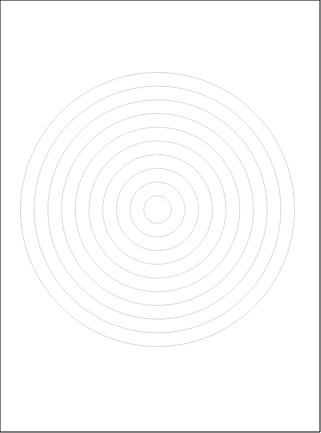
| Category | C2 | C1 | E8 | E7 | E6 | E5 | E4 | E3 | E2 | E1 | D4 | D3 | D2 | D1 |
|---|---|---|---|---|---|---|---|---|---|---|---|---|---|---|
| 0.0 | 0 | 0 | 0 | 0 | 0 | 0 | 0 | 0 | 0 | 0 | 0 | 0 | 0 | 0 |
| 1.0 | 0 | 0 | 0 | 0 | 0 | 0 | 0 | 0 | 0 | 0 | 0 | 0 | 0 | 0 |
| 2.0 | 0 | 0 | 0 | 0 | 0 | 0 | 0 | 0 | 0 | 0 | 0 | 0 | 0 | 0 |
| 3.0 | 0 | 0 | 0 | 0 | 0 | 0 | 0 | 0 | 0 | 0 | 0 | 0 | 0 | 0 |
| 4.0 | 0 | 0 | 0 | 0 | 0 | 0 | 0 | 0 | 0 | 0 | 0 | 0 | 0 | 0 |
| 5.0 | 0 | 0 | 0 | 0 | 0 | 0 | 0 | 0 | 0 | 0 | 0 | 0 | 0 | 0 |
| 6.0 | 0 | 0 | 0 | 0 | 0 | 0 | 0 | 0 | 0 | 0 | 0 | 0 | 0 | 0 |
| 7.0 | 0 | 0 | 0 | 0 | 0 | 0 | 0 | 0 | 0 | 0 | 0 | 0 | 0 | 0 |
| 8.0 | 0 | 0 | 0 | 0 | 0 | 0 | 0 | 0 | 0 | 0 | 0 | 0 | 0 | 0 |
| 9.0 | 0 | 0 | 0 | 0 | 0 | 0 | 0 | 0 | 0 | 0 | 0 | 0 | 0 | 0 |
| 10.0 | 0 | 0 | 0 | 0 | 0 | 0 | 0 | 0 | 0 | 0 | 0 | 0 | 0 | 0 |
| 11.0 | 0 | 0 | 0 | 0 | 0 | 0 | 0 | 0 | 0 | 0 | 0 | 0 | 0 | 0 |
| 12.0 | 0 | 0 | 0 | 0 | 0 | 0 | 0 | 0 | 0 | 0 | 0 | 0 | 0 | 0 |
| 13.0 | 0 | 0 | 0 | 0 | 0 | 0 | 0 | 0 | 0 | 0 | 0 | 0 | 0 | 0 |
| 14.0 | 0 | 0 | 0 | 0 | 0 | 0 | 0 | 0 | 0 | 0 | 0 | 0 | 0 | 0 |
| 15.0 | 0 | 0 | 0 | 0 | 0 | 0 | 0 | 0 | 0 | 0 | 0 | 0 | 0 | 0 |
| 16.0 | 0 | 0 | 0 | 0 | 0 | 0 | 0 | 0 | 0 | 0 | 0 | 0 | 0 | 0 |
| 17.0 | 0 | 0 | 0 | 0 | 0 | 0 | 0 | 0 | 0 | 0 | 0 | 0 | 0 | 0 |
| 18.0 | 0 | 0 | 0 | 0 | 0 | 0 | 0 | 0 | 0 | 0 | 0 | 0 | 0 | 0 |
| 19.0 | 0 | 0 | 0 | 0 | 0 | 0 | 0 | 0 | 0 | 0 | 0 | 0 | 0 | 0 |
| 20.0 | 0 | 0 | 0 | 0 | 0 | 0 | 0 | 0 | 0 | 0 | 0 | 0 | 0 | 0 |
| 21.0 | 0 | 0 | 0 | 0 | 0 | 0 | 0 | 0 | 0 | 0 | 0 | 0 | 0 | 0 |
| 22.0 | 0 | 0 | 0 | 0 | 0 | 0 | 0 | 0 | 0 | 0 | 0 | 0 | 0 | 0 |
| 23.0 | 0 | 0 | 0 | 0 | 0 | 0 | 0 | 0 | 0 | 0 | 0 | 0 | 0 | 0 |
| 24.0 | 0 | 0 | 0 | 0 | 0 | 0 | 0 | 0 | 0 | 0 | 0 | 0 | 0 | 0 |
| 25.0 | 0 | 0 | 0 | 0 | 0 | 0 | 0 | 0 | 0 | 0 | 0 | 0 | 0 | 0 |
| 26.0 | 0 | 0 | 0 | 0 | 0 | 0 | 0 | 0 | 0 | 0 | 0 | 0 | 0 | 0 |
| 27.0 | 0 | 0 | 0 | 0 | 0 | 0 | 0 | 0 | 0 | 0 | 0 | 0 | 0 | 0 |
| 28.0 | 0 | 0 | 0 | 0 | 0 | 0 | 0 | 0 | 0 | 0 | 0 | 0 | 0 | 0 |
| 29.0 | 0 | 0 | 0 | 0 | 0 | 0 | 0 | 0 | 0 | 0 | 0 | 0 | 0 | 0 |
| 30.0 | 0 | 0 | 0 | 0 | 0 | 0 | 0 | 0 | 0 | 0 | 0 | 0 | 0 | 0 |
| 31.0 | 0 | 0 | 0 | 0 | 0 | 0 | 0 | 0 | 0 | 0 | 0 | 0 | 0 | 0 |
| 32.0 | 0 | 0 | 0 | 0 | 0 | 0 | 0 | 0 | 0 | 0 | 0 | 0 | 0 | 0 |
| 33.0 | 0 | 0 | 0 | 0 | 0 | 0 | 0 | 0 | 0 | 0 | 0 | 0 | 0 | 0 |
| 34.0 | 0 | 0 | 0 | 0 | 0 | 0 | 0 | 0 | 0 | 0 | 0 | 0 | 0 | 0 |
| 35.0 | 0 | 0 | 0 | 0 | 0 | 0 | 0 | 0 | 0 | 0 | 0 | 0 | 0 | 0 |
| 36.0 | 0 | 0 | 0 | 0 | 0 | 0 | 0 | 0 | 0 | 0 | 0 | 0 | 0 | 0 |
| 37.0 | 0 | 0 | 0 | 0 | 0 | 0 | 0 | 0 | 0 | 0 | 0 | 0 | 0 | 0 |
| 38.0 | 0 | 0 | 0 | 0 | 0 | 0 | 0 | 0 | 0 | 0 | 0 | 0 | 0 | 0 |
| 39.0 | 0 | 0 | 0 | 0 | 0 | 0 | 0 | 0 | 0 | 0 | 0 | 0 | 0 | 0 |
| 40.0 | 0 | 0 | 0 | 0 | 0 | 0 | 0 | 0 | 0 | 0 | 0 | 0 | 0 | 0 |
| 41.0 | 0 | 0 | 0 | 0 | 0 | 0 | 0 | 0 | 0 | 0 | 0 | 0 | 0 | 0 |
| 42.0 | 0 | 0 | 0 | 0 | 0 | 0 | 0 | 0 | 0 | 0 | 0 | 0 | 0 | 0 |
| 43.0 | 0 | 0 | 0 | 0 | 0 | 0 | 0 | 0 | 0 | 0 | 0 | 0 | 0 | 0 |
| 44.0 | 0 | 0 | 0 | 0 | 0 | 0 | 0 | 0 | 0 | 0 | 0 | 0 | 0 | 0 |
| 45.0 | 0 | 0 | 0 | 0 | 0 | 0 | 0 | 0 | 0 | 0 | 0 | 0 | 0 | 0 |
| 46.0 | 0 | 0 | 0 | 0 | 0 | 0 | 0 | 0 | 0 | 0 | 0 | 0 | 0 | 0 |
| 47.0 | 0 | 0 | 0 | 0 | 0 | 0 | 0 | 0 | 0 | 0 | 0 | 0 | 0 | 0 |
| 48.0 | 0 | 0 | 0 | 0 | 0 | 0 | 0 | 0 | 0 | 0 | 0 | 0 | 0 | 0 |
| 49.0 | 0 | 0 | 0 | 0 | 0 | 0 | 0 | 0 | 0 | 0 | 0 | 0 | 0 | 0 |
| 50.0 | 0 | 0 | 0 | 0 | 0 | 0 | 0 | 0 | 0 | 0 | 0 | 0 | 0 | 0 |
| 51.0 | 0 | 0 | 0 | 0 | 0 | 0 | 0 | 0 | 0 | 0 | 0 | 0 | 0 | 0 |
| 52.0 | 0 | 0 | 0 | 0 | 0 | 0 | 0 | 0 | 0 | 0 | 0 | 0 | 0 | 0 |
| 53.0 | 0 | 0 | 0 | 0 | 0 | 0 | 0 | 0 | 0 | 0 | 0 | 0 | 0 | 0 |
| 54.0 | 0 | 0 | 0 | 0 | 0 | 0 | 0 | 0 | 0 | 0 | 0 | 0 | 0 | 0 |
| 55.0 | 0 | 0 | 0 | 0 | 0 | 0 | 0 | 0 | 0 | 0 | 0 | 0 | 0 | 0 |
| 56.0 | 0 | 0 | 0 | 0 | 0 | 0 | 0 | 0 | 0 | 0 | 0 | 0 | 0 | 0 |
| 57.0 | 0 | 0 | 0 | 0 | 0 | 0 | 0 | 0 | 0 | 0 | 0 | 0 | 0 | 0 |
| 58.0 | 0 | 0 | 0 | 0 | 0 | 0 | 0 | 0 | 0 | 0 | 0 | 0 | 0 | 0 |
| 59.0 | 0 | 0 | 0 | 0 | 0 | 0 | 0 | 0 | 0 | 0 | 0 | 0 | 0 | 0 |
| 60.0 | 0 | 0 | 0 | 0 | 0 | 0 | 0 | 0 | 0 | 0 | 0 | 0 | 0 | 0 |
| 61.0 | 0 | 0 | 0 | 0 | 0 | 0 | 0 | 0 | 0 | 0 | 0 | 0 | 0 | 0 |
| 62.0 | 0 | 0 | 0 | 0 | 0 | 0 | 0 | 0 | 0 | 0 | 0 | 0 | 0 | 0 |
| 63.0 | 0 | 0 | 0 | 0 | 0 | 0 | 0 | 0 | 0 | 0 | 0 | 0 | 0 | 0 |
| 64.0 | 0 | 0 | 0 | 0 | 0 | 0 | 0 | 0 | 0 | 0 | 0 | 0 | 0 | 0 |
| 65.0 | 0 | 0 | 0 | 0 | 0 | 0 | 0 | 0 | 0 | 0 | 0 | 0 | 0 | 0 |
| 66.0 | 0 | 0 | 0 | 0 | 0 | 0 | 0 | 0 | 0 | 0 | 0 | 0 | 0 | 0 |
| 67.0 | 0 | 0 | 0 | 0 | 0 | 0 | 0 | 0 | 0 | 0 | 0 | 0 | 0 | 0 |
| 68.0 | 0 | 0 | 0 | 0 | 0 | 0 | 0 | 0 | 0 | 0 | 0 | 0 | 0 | 0 |
| 69.0 | 0 | 0 | 0 | 0 | 0 | 0 | 0 | 0 | 0 | 0 | 0 | 0 | 0 | 0 |
| 70.0 | 0 | 0 | 0 | 0 | 0 | 0 | 0 | 0 | 0 | 0 | 0 | 0 | 0 | 0 |
| 71.0 | 0 | 0 | 0 | 0 | 0 | 0 | 0 | 0 | 0 | 0 | 0 | 0 | 0 | 0 |
| 72.0 | 0 | 0 | 0 | 0 | 0 | 0 | 0 | 0 | 0 | 0 | 0 | 0 | 0 | 0 |
| 73.0 | 0 | 0 | 0 | 0 | 0 | 0 | 0 | 0 | 0 | 0 | 0 | 0 | 0 | 0 |
| 74.0 | 0 | 0 | 0 | 0 | 0 | 0 | 0 | 0 | 0 | 0 | 0 | 0 | 0 | 0 |
| 75.0 | 0 | 0 | 0 | 0 | 0 | 0 | 0 | 0 | 0 | 0 | 0 | 0 | 0 | 0 |
| 76.0 | 0 | 0 | 0 | 0 | 0 | 0 | 0 | 0 | 0 | 0 | 0 | 0 | 0 | 0 |
| 77.0 | 0 | 0 | 0 | 0 | 0 | 0 | 0 | 0 | 0 | 0 | 0 | 0 | 0 | 0 |
| 78.0 | 0 | 0 | 0 | 0 | 0 | 0 | 0 | 0 | 0 | 0 | 0 | 0 | 0 | 0 |
| 79.0 | 0 | 0 | 0 | 0 | 0 | 0 | 0 | 0 | 0 | 0 | 0 | 0 | 0 | 0 |
| 80.0 | 0 | 0 | 0 | 0 | 0 | 0 | 0 | 0 | 0 | 0 | 0 | 0 | 0 | 0 |
| 81.0 | 0 | 0 | 0 | 0 | 0 | 0 | 0 | 0 | 0 | 0 | 0 | 0 | 0 | 0 |
| 82.0 | 0 | 0 | 0 | 0 | 0 | 0 | 0 | 0 | 0 | 0 | 0 | 0 | 0 | 0 |
| 83.0 | 0 | 0 | 0 | 0 | 0 | 0 | 0 | 0 | 0 | 0 | 0 | 0 | 0 | 0 |
| 84.0 | 0 | 0 | 0 | 0 | 0 | 0 | 0 | 0 | 0 | 0 | 0 | 0 | 0 | 0 |
| 85.0 | 0 | 0 | 0 | 0 | 0 | 0 | 0 | 0 | 0 | 0 | 0 | 0 | 0 | 0 |
| 86.0 | 0 | 0 | 0 | 0 | 0 | 0 | 0 | 0 | 0 | 0 | 0 | 0 | 0 | 0 |
| 87.0 | 0 | 0 | 0 | 0 | 0 | 0 | 0 | 0 | 0 | 0 | 0 | 0 | 0 | 0 |
| 88.0 | 0 | 0 | 0 | 0 | 0 | 0 | 0 | 0 | 0 | 0 | 0 | 0 | 0 | 0 |
| 89.0 | 0 | 0 | 0 | 0 | 0 | 0 | 0 | 0 | 0 | 0 | 0 | 0 | 0 | 0 |
| 90.0 | 0 | 0 | 0 | 0 | 0 | 0 | 0 | 0 | 0 | 0 | 0 | 0 | 0 | 0 |
| 91.0 | 0 | 0 | 0 | 0 | 0 | 0 | 0 | 0 | 0 | 0 | 0 | 0 | 0 | 0 |
| 92.0 | 0 | 0 | 0 | 0 | 0 | 0 | 0 | 0 | 0 | 0 | 0 | 0 | 0 | 0 |
| 93.0 | 0 | 0 | 0 | 0 | 0 | 0 | 0 | 0 | 0 | 0 | 0 | 0 | 0 | 0 |
| 94.0 | 0 | 0 | 0 | 0 | 0 | 0 | 0 | 0 | 0 | 0 | 0 | 0 | 0 | 0 |
| 95.0 | 0 | 0 | 0 | 0 | 0 | 0 | 0 | 0 | 0 | 0 | 0 | 0 | 0 | 0 |
| 96.0 | 0 | 0 | 0 | 0 | 0 | 0 | 0 | 0 | 0 | 0 | 0 | 0 | 0 | 0 |
| 97.0 | 0 | 0 | 0 | 0 | 0 | 0 | 0 | 0 | 0 | 0 | 0 | 0 | 0 | 0 |
| 98.0 | 0 | 0 | 0 | 0 | 0 | 0 | 0 | 0 | 0 | 0 | 0 | 0 | 0 | 0 |
| 99.0 | 0 | 0 | 0 | 0 | 0 | 0 | 0 | 0 | 0 | 0 | 0 | 0 | 0 | 0 |
| 100.0 | 0 | 0 | 0 | 0 | 0 | 0 | 0 | 0 | 0 | 0 | 0 | 0 | 0 | 0 |
| 101.0 | 0 | 0 | 0 | 0 | 0 | 0 | 0 | 0 | 0 | 0 | 0 | 0 | 0 | 0 |
| 102.0 | 0 | 0 | 0 | 0 | 0 | 0 | 0 | 0 | 0 | 0 | 0 | 0 | 0 | 0 |
| 103.0 | 0 | 0 | 0 | 0 | 0 | 0 | 0 | 0 | 0 | 0 | 0 | 0 | 0 | 0 |
| 104.0 | 0 | 0 | 0 | 0 | 0 | 0 | 0 | 0 | 0 | 0 | 0 | 0 | 0 | 0 |
| 105.0 | 0 | 0 | 0 | 0 | 0 | 0 | 0 | 0 | 0 | 0 | 0 | 0 | 0 | 0 |
| 106.0 | 0 | 0 | 0 | 0 | 0 | 0 | 0 | 0 | 0 | 0 | 0 | 0 | 0 | 0 |
| 107.0 | 0 | 0 | 0 | 0 | 0 | 0 | 0 | 0 | 0 | 0 | 0 | 0 | 0 | 0 |
| 108.0 | 0 | 0 | 0 | 0 | 0 | 0 | 0 | 0 | 0 | 0 | 0 | 0 | 0 | 0 |
| 109.0 | 0 | 0 | 0 | 0 | 0 | 0 | 0 | 0 | 0 | 0 | 0 | 0 | 0 | 0 |
| 110.0 | 0 | 0 | 0 | 0 | 0 | 0 | 0 | 0 | 0 | 0 | 0 | 0 | 0 | 0 |
| 111.0 | 0 | 0 | 0 | 0 | 0 | 0 | 0 | 0 | 0 | 0 | 0 | 0 | 0 | 0 |
| 112.0 | 0 | 0 | 0 | 0 | 0 | 0 | 0 | 0 | 0 | 0 | 0 | 0 | 0 | 0 |
| 113.0 | 0 | 0 | 0 | 0 | 0 | 0 | 0 | 0 | 0 | 0 | 0 | 0 | 0 | 0 |
| 114.0 | 0 | 0 | 0 | 0 | 0 | 0 | 0 | 0 | 0 | 0 | 0 | 0 | 0 | 0 |
| 115.0 | 0 | 0 | 0 | 0 | 0 | 0 | 0 | 0 | 0 | 0 | 0 | 0 | 0 | 0 |
| 116.0 | 0 | 0 | 0 | 0 | 0 | 0 | 0 | 0 | 0 | 0 | 0 | 0 | 0 | 0 |
| 117.0 | 0 | 0 | 0 | 0 | 0 | 0 | 0 | 0 | 0 | 0 | 0 | 0 | 0 | 0 |
| 118.0 | 0 | 0 | 0 | 0 | 0 | 0 | 0 | 0 | 0 | 0 | 0 | 0 | 0 | 0 |
| 119.0 | 0 | 0 | 0 | 0 | 0 | 0 | 0 | 0 | 0 | 0 | 0 | 0 | 0 | 0 |
| 120.0 | 0 | 0 | 0 | 0 | 0 | 0 | 0 | 0 | 0 | 0 | 0 | 0 | 0 | 0 |
| 121.0 | 0 | 0 | 0 | 0 | 0 | 0 | 0 | 0 | 0 | 0 | 0 | 0 | 0 | 0 |
| 122.0 | 0 | 0 | 0 | 0 | 0 | 0 | 0 | 0 | 0 | 0 | 0 | 0 | 0 | 0 |
| 123.0 | 0 | 0 | 0 | 0 | 0 | 0 | 0 | 0 | 0 | 0 | 0 | 0 | 0 | 0 |
| 124.0 | 0 | 0 | 0 | 0 | 0 | 0 | 0 | 0 | 0 | 0 | 0 | 0 | 0 | 0 |
| 125.0 | 0 | 0 | 0 | 0 | 0 | 0 | 0 | 0 | 0 | 0 | 0 | 0 | 0 | 0 |
| 126.0 | 0 | 0 | 0 | 0 | 0 | 0 | 0 | 0 | 0 | 0 | 0 | 0 | 0 | 0 |
| 127.0 | 0 | 0 | 0 | 0 | 0 | 0 | 0 | 0 | 0 | 0 | 0 | 0 | 0 | 0 |
| 128.0 | 0 | 0 | 0 | 0 | 0 | 0 | 0 | 0 | 0 | 0 | 0 | 0 | 0 | 0 |
| 129.0 | 0 | 0 | 0 | 0 | 0 | 0 | 0 | 0 | 0 | 0 | 0 | 0 | 0 | 0 |
| 130.0 | 0 | 0 | 0 | 0 | 0 | 0 | 0 | 0 | 0 | 0 | 0 | 0 | 0 | 0 |
| 131.0 | 0 | 0 | 0 | 0 | 0 | 0 | 0 | 0 | 0 | 0 | 0 | 0 | 0 | 0 |
| 132.0 | 0 | 0 | 0 | 0 | 0 | 0 | 0 | 0 | 0 | 0 | 0 | 0 | 0 | 0 |
| 133.0 | 0 | 0 | 0 | 0 | 0 | 0 | 0 | 0 | 0 | 0 | 0 | 0 | 0 | 0 |
| 134.0 | 0 | 0 | 0 | 0 | 0 | 0 | 0 | 0 | 0 | 0 | 0 | 0 | 0 | 0 |
| 135.0 | 0 | 0 | 0 | 0 | 0 | 0 | 0 | 0 | 0 | 0 | 0 | 0 | 0 | 0 |
| 136.0 | 0 | 0 | 0 | 0 | 0 | 0 | 0 | 0 | 0 | 0 | 0 | 0 | 0 | 0 |
| 137.0 | 0 | 0 | 0 | 0 | 0 | 0 | 0 | 0 | 0 | 0 | 0 | 0 | 0 | 0 |
| 138.0 | 0 | 0 | 0 | 0 | 0 | 0 | 0 | 0 | 0 | 0 | 0 | 0 | 0 | 0 |
| 139.0 | 0 | 0 | 0 | 0 | 0 | 0 | 0 | 0 | 0 | 0 | 0 | 0 | 0 | 0 |
| 140.0 | 0 | 0 | 0 | 0 | 0 | 0 | 0 | 0 | 0 | 0 | 0 | 0 | 0 | 0 |
| 141.0 | 0 | 0 | 0 | 0 | 0 | 0 | 0 | 0 | 0 | 0 | 0 | 0 | 0 | 0 |
| 142.0 | 0 | 0 | 0 | 0 | 0 | 0 | 0 | 0 | 0 | 0 | 0 | 0 | 0 | 0 |
| 143.0 | 0 | 0 | 0 | 0 | 0 | 0 | 0 | 0 | 0 | 0 | 0 | 0 | 0 | 0 |
| 144.0 | 0 | 0 | 0 | 0 | 0 | 0 | 0 | 0 | 0 | 0 | 0 | 0 | 0 | 0 |
| 145.0 | 0 | 0 | 0 | 0 | 0 | 0 | 0 | 0 | 0 | 0 | 0 | 0 | 0 | 0 |
| 146.0 | 0 | 0 | 0 | 0 | 0 | 0 | 0 | 0 | 0 | 0 | 0 | 0 | 0 | 0 |
| 147.0 | 0 | 0 | 0 | 0 | 0 | 0 | 0 | 0 | 0 | 0 | 0 | 0 | 0 | 0 |
| 148.0 | 0 | 0 | 0 | 0 | 0 | 0 | 0 | 0 | 0 | 0 | 0 | 0 | 0 | 0 |
| 149.0 | 0 | 0 | 0 | 0 | 0 | 0 | 0 | 0 | 0 | 0 | 0 | 0 | 0 | 0 |
| 150.0 | 0 | 0 | 0 | 0 | 0 | 0 | 0 | 0 | 0 | 0 | 0 | 0 | 0 | 0 |
| 151.0 | 0 | 0 | 0 | 0 | 0 | 0 | 0 | 0 | 0 | 0 | 0 | 0 | 0 | 0 |
| 152.0 | 0 | 0 | 0 | 0 | 0 | 0 | 0 | 0 | 0 | 0 | 0 | 0 | 0 | 0 |
| 153.0 | 0 | 0 | 0 | 0 | 0 | 0 | 0 | 0 | 0 | 0 | 0 | 0 | 0 | 0 |
| 154.0 | 0 | 0 | 0 | 0 | 0 | 0 | 0 | 0 | 0 | 0 | 0 | 0 | 0 | 0 |
| 155.0 | 0 | 0 | 0 | 0 | 0 | 0 | 0 | 0 | 0 | 0 | 0 | 0 | 0 | 0 |
| 156.0 | 0 | 0 | 0 | 0 | 0 | 0 | 0 | 0 | 0 | 0 | 0 | 0 | 0 | 0 |
| 157.0 | 0 | 0 | 0 | 0 | 0 | 0 | 0 | 0 | 0 | 0 | 0 | 0 | 0 | 0 |
| 158.0 | 0 | 0 | 0 | 0 | 0 | 0 | 0 | 0 | 0 | 0 | 0 | 0 | 0 | 0 |
| 159.0 | 0 | 0 | 0 | 0 | 0 | 0 | 0 | 0 | 0 | 0 | 0 | 0 | 0 | 0 |
| 160.0 | 0 | 0 | 0 | 0 | 0 | 0 | 0 | 0 | 0 | 0 | 0 | 0 | 0 | 0 |
| 161.0 | 0 | 0 | 0 | 0 | 0 | 0 | 0 | 0 | 0 | 0 | 0 | 0 | 0 | 0 |
| 162.0 | 0 | 0 | 0 | 0 | 0 | 0 | 0 | 0 | 0 | 0 | 0 | 0 | 0 | 0 |
| 163.0 | 0 | 0 | 0 | 0 | 0 | 0 | 0 | 0 | 0 | 0 | 0 | 0 | 0 | 0 |
| 164.0 | 0 | 0 | 0 | 0 | 0 | 0 | 0 | 0 | 0 | 0 | 0 | 0 | 0 | 0 |
| 165.0 | 0 | 0 | 0 | 0 | 0 | 0 | 0 | 0 | 0 | 0 | 0 | 0 | 0 | 0 |
| 166.0 | 0 | 0 | 0 | 0 | 0 | 0 | 0 | 0 | 0 | 0 | 0 | 0 | 0 | 0 |
| 167.0 | 0 | 0 | 0 | 0 | 0 | 0 | 0 | 0 | 0 | 0 | 0 | 0 | 0 | 0 |
| 168.0 | 0 | 0 | 0 | 0 | 0 | 0 | 0 | 0 | 0 | 0 | 0 | 0 | 0 | 0 |
| 169.0 | 0 | 0 | 0 | 0 | 0 | 0 | 0 | 0 | 0 | 0 | 0 | 0 | 0 | 0 |
| 170.0 | 0 | 0 | 0 | 0 | 0 | 0 | 0 | 0 | 0 | 0 | 0 | 0 | 0 | 0 |
| 171.0 | 0 | 0 | 0 | 0 | 0 | 0 | 0 | 0 | 0 | 0 | 0 | 0 | 0 | 0 |
| 172.0 | 0 | 0 | 0 | 0 | 0 | 0 | 0 | 0 | 0 | 0 | 0 | 0 | 0 | 0 |
| 173.0 | 0 | 0 | 0 | 0 | 0 | 0 | 0 | 0 | 0 | 0 | 0 | 0 | 0 | 0 |
| 174.0 | 0 | 0 | 0 | 0 | 0 | 0 | 0 | 0 | 0 | 0 | 0 | 0 | 0 | 0 |
| 175.0 | 0 | 0 | 0 | 0 | 0 | 0 | 0 | 0 | 0 | 0 | 0 | 0 | 0 | 0 |
| 176.0 | 0 | 0 | 0 | 0 | 0 | 0 | 0 | 0 | 0 | 0 | 0 | 0 | 0 | 0 |
| 177.0 | 0 | 0 | 0 | 0 | 0 | 0 | 0 | 0 | 0 | 0 | 0 | 0 | 0 | 0 |
| 178.0 | 0 | 0 | 0 | 0 | 0 | 0 | 0 | 0 | 0 | 0 | 0 | 0 | 0 | 0 |
| 179.0 | 0 | 0 | 0 | 0 | 0 | 0 | 0 | 0 | 0 | 0 | 0 | 0 | 0 | 0 |
| 180.0 | 0 | 0 | 0 | 0 | 0 | 0 | 0 | 0 | 0 | 0 | 0 | 0 | 0 | 0 |
| 181.0 | 0 | 0 | 0 | 0 | 0 | 0 | 0 | 0 | 0 | 0 | 0 | 0 | 0 | 0 |
| 182.0 | 0 | 0 | 0 | 0 | 0 | 0 | 0 | 0 | 0 | 0 | 0 | 0 | 0 | 0 |
| 183.0 | 0 | 0 | 0 | 0 | 0 | 0 | 0 | 0 | 0 | 0 | 0 | 0 | 0 | 0 |
| 184.0 | 0 | 0 | 0 | 0 | 0 | 0 | 0 | 0 | 0 | 0 | 0 | 0 | 0 | 0 |
| 185.0 | 0 | 0 | 0 | 0 | 0 | 0 | 0 | 0 | 0 | 0 | 0 | 0 | 0 | 0 |
| 186.0 | 0 | 0 | 0 | 0 | 0 | 0 | 0 | 0 | 0 | 0 | 0 | 0 | 0 | 0 |
| 187.0 | 0 | 0 | 0 | 0 | 0 | 0 | 0 | 0 | 0 | 0 | 0 | 0 | 0 | 0 |
| 188.0 | 0 | 0 | 0 | 0 | 0 | 0 | 0 | 0 | 0 | 0 | 0 | 0 | 0 | 0 |
| 189.0 | 0 | 0 | 0 | 0 | 0 | 0 | 0 | 0 | 0 | 0 | 0 | 0 | 0 | 0 |
| 190.0 | 0 | 0 | 0 | 0 | 0 | 0 | 0 | 0 | 0 | 0 | 0 | 0 | 0 | 0 |
| 191.0 | 0 | 0 | 0 | 0 | 0 | 0 | 0 | 0 | 0 | 0 | 0 | 0 | 0 | 0 |
| 192.0 | 0 | 0 | 0 | 0 | 0 | 0 | 0 | 0 | 0 | 0 | 0 | 0 | 0 | 0 |
| 193.0 | 0 | 0 | 0 | 0 | 0 | 0 | 0 | 0 | 0 | 0 | 0 | 0 | 0 | 0 |
| 194.0 | 0 | 0 | 0 | 0 | 0 | 0 | 0 | 0 | 0 | 0 | 0 | 0 | 0 | 0 |
| 195.0 | 0 | 0 | 0 | 0 | 0 | 0 | 0 | 0 | 0 | 0 | 0 | 0 | 0 | 0 |
| 196.0 | 0 | 0 | 0 | 0 | 0 | 0 | 0 | 0 | 0 | 0 | 0 | 0 | 0 | 0 |
| 197.0 | 0 | 0 | 0 | 0 | 0 | 0 | 0 | 0 | 0 | 0 | 0 | 0 | 0 | 0 |
| 198.0 | 0 | 0 | 0 | 0 | 0 | 0 | 0 | 0 | 0 | 0 | 0 | 0 | 0 | 0 |
| 199.0 | 0 | 0 | 0 | 0 | 0 | 0 | 0 | 0 | 0 | 0 | 0 | 0 | 0 | 0 |
| 200.0 | 0 | 0 | 0 | 0 | 0 | 0 | 0 | 0 | 0 | 0 | 0 | 0 | 0 | 0 |
| 201.0 | 0 | 0 | 0 | 0 | 0 | 0 | 0 | 0 | 0 | 0 | 0 | 0 | 0 | 0 |
| 202.0 | 0 | 0 | 0 | 0 | 0 | 0 | 0 | 0 | 0 | 0 | 0 | 0 | 0 | 0 |
| 203.0 | 0 | 0 | 0 | 0 | 0 | 0 | 0 | 0 | 0 | 0 | 0 | 0 | 0 | 0 |
| 204.0 | 0 | 0 | 0 | 0 | 0 | 0 | 0 | 0 | 0 | 0 | 0 | 0 | 0 | 0 |
| 205.0 | 0 | 0 | 0 | 0 | 0 | 0 | 0 | 0 | 0 | 0 | 0 | 0 | 0 | 0 |
| 206.0 | 0 | 0 | 0 | 0 | 0 | 0 | 0 | 0 | 0 | 0 | 0 | 0 | 0 | 0 |
| 207.0 | 0 | 0 | 0 | 0 | 0 | 0 | 0 | 0 | 0 | 0 | 0 | 0 | 0 | 0 |
| 208.0 | 0 | 0 | 0 | 0 | 0 | 0 | 0 | 0 | 0 | 0 | 0 | 0 | 0 | 0 |
| 209.0 | 0 | 0 | 0 | 0 | 0 | 0 | 0 | 0 | 0 | 0 | 0 | 0 | 0 | 0 |
| 210.0 | 0 | 0 | 0 | 0 | 0 | 0 | 0 | 0 | 0 | 0 | 0 | 0 | 0 | 0 |
| 211.0 | 0 | 0 | 0 | 0 | 0 | 0 | 0 | 0 | 0 | 0 | 0 | 0 | 0 | 0 |
| 212.0 | 0 | 0 | 0 | 0 | 0 | 0 | 0 | 0 | 0 | 0 | 0 | 0 | 0 | 0 |
| 213.0 | 0 | 0 | 0 | 0 | 0 | 0 | 0 | 0 | 0 | 0 | 0 | 0 | 0 | 0 |
| 214.0 | 0 | 0 | 0 | 0 | 0 | 0 | 0 | 0 | 0 | 0 | 0 | 0 | 0 | 0 |
| 215.0 | 0 | 0 | 0 | 0 | 0 | 0 | 0 | 0 | 0 | 0 | 0 | 0 | 0 | 0 |
| 216.0 | 0 | 0 | 0 | 0 | 0 | 0 | 0 | 0 | 0 | 0 | 0 | 0 | 0 | 0 |
| 217.0 | 0 | 0 | 0 | 0 | 0 | 0 | 0 | 0 | 0 | 0 | 0 | 0 | 0 | 0 |
| 218.0 | 0 | 0 | 0 | 0 | 0 | 0 | 0 | 0 | 0 | 0 | 0 | 0 | 0 | 0 |
| 219.0 | 0 | 0 | 0 | 0 | 0 | 0 | 0 | 0 | 0 | 0 | 0 | 0 | 0 | 0 |
| 220.0 | 0 | 0 | 0 | 0 | 0 | 0 | 0 | 0 | 0 | 0 | 0 | 0 | 0 | 0 |
| 221.0 | 0 | 0 | 0 | 0 | 0 | 0 | 0 | 0 | 0 | 0 | 0 | 0 | 0 | 0 |
| 222.0 | 0 | 0 | 0 | 0 | 0 | 0 | 0 | 0 | 0 | 0 | 0 | 0 | 0 | 0 |
| 223.0 | 0 | 0 | 0 | 0 | 0 | 0 | 0 | 0 | 0 | 0 | 0 | 0 | 0 | 0 |
| 224.0 | 0 | 0 | 0 | 0 | 0 | 0 | 0 | 0 | 0 | 0 | 0 | 0 | 0 | 0 |
| 225.0 | 0 | 0 | 0 | 0 | 0 | 0 | 0 | 0 | 0 | 0 | 0 | 0 | 0 | 0 |
| 226.0 | 0 | 0 | 0 | 0 | 0 | 0 | 0 | 0 | 0 | 0 | 0 | 0 | 0 | 0 |
| 227.0 | 0 | 0 | 0 | 0 | 0 | 0 | 0 | 0 | 0 | 0 | 0 | 0 | 0 | 0 |
| 228.0 | 0 | 0 | 0 | 0 | 0 | 0 | 0 | 0 | 0 | 0 | 0 | 0 | 0 | 0 |
| 229.0 | 0 | 0 | 0 | 0 | 0 | 0 | 0 | 0 | 0 | 0 | 0 | 0 | 0 | 0 |
| 230.0 | 0 | 0 | 0 | 0 | 0 | 0 | 0 | 0 | 0 | 0 | 0 | 0 | 0 | 0 |
| 231.0 | 0 | 0 | 0 | 0 | 0 | 0 | 0 | 0 | 0 | 0 | 0 | 0 | 0 | 0 |
| 232.0 | 0 | 0 | 0 | 0 | 0 | 0 | 0 | 0 | 0 | 0 | 0 | 0 | 0 | 0 |
| 233.0 | 0 | 0 | 0 | 0 | 0 | 0 | 0 | 0 | 0 | 0 | 0 | 0 | 0 | 0 |
| 234.0 | 0 | 0 | 0 | 0 | 0 | 0 | 0 | 0 | 0 | 0 | 0 | 0 | 0 | 0 |
| 235.0 | 0 | 0 | 0 | 0 | 0 | 0 | 0 | 0 | 0 | 0 | 0 | 0 | 0 | 0 |
| 236.0 | 0 | 0 | 0 | 0 | 0 | 0 | 0 | 0 | 0 | 0 | 0 | 0 | 0 | 0 |
| 237.0 | 0 | 0 | 0 | 0 | 0 | 0 | 0 | 0 | 0 | 0 | 0 | 0 | 0 | 0 |
| 238.0 | 0 | 0 | 0 | 0 | 0 | 0 | 0 | 0 | 0 | 0 | 0 | 0 | 0 | 0 |
| 239.0 | 0 | 0 | 0 | 0 | 0 | 0 | 0 | 0 | 0 | 0 | 0 | 0 | 0 | 0 |
| 240.0 | 0 | 0 | 0 | 0 | 0 | 0 | 0 | 0 | 0 | 0 | 0 | 0 | 0 | 0 |
| 241.0 | 0 | 0 | 0 | 0 | 0 | 0 | 0 | 0 | 0 | 0 | 0 | 0 | 0 | 0 |
| 242.0 | 0 | 0 | 0 | 0 | 0 | 0 | 0 | 0 | 0 | 0 | 0 | 0 | 0 | 0 |
| 243.0 | 0 | 0 | 0 | 0 | 0 | 0 | 0 | 0 | 0 | 0 | 0 | 0 | 0 | 0 |
| 244.0 | 0 | 0 | 0 | 0 | 0 | 0 | 0 | 0 | 0 | 0 | 0 | 0 | 0 | 0 |
| 245.0 | 0 | 0 | 0 | 0 | 0 | 0 | 0 | 0 | 0 | 0 | 0 | 0 | 0 | 0 |
| 246.0 | 0 | 0 | 0 | 0 | 0 | 0 | 0 | 0 | 0 | 0 | 0 | 0 | 0 | 0 |
| 247.0 | 0 | 0 | 0 | 0 | 0 | 0 | 0 | 0 | 0 | 0 | 0 | 0 | 0 | 0 |
| 248.0 | 0 | 0 | 0 | 0 | 0 | 0 | 0 | 0 | 0 | 0 | 0 | 0 | 0 | 0 |
| 249.0 | 0 | 0 | 0 | 0 | 0 | 0 | 0 | 0 | 0 | 0 | 0 | 0 | 0 | 0 |
| 250.0 | 0 | 0 | 0 | 0 | 0 | 0 | 0 | 0 | 0 | 0 | 0 | 0 | 0 | 0 |
| 251.0 | 0 | 0 | 0 | 0 | 0 | 0 | 0 | 0 | 0 | 0 | 0 | 0 | 0 | 0 |
| 252.0 | 0 | 0 | 0 | 0 | 0 | 0 | 0 | 0 | 0 | 0 | 0 | 0 | 0 | 0 |
| 253.0 | 0 | 0 | 0 | 0 | 0 | 0 | 0 | 0 | 0 | 0 | 0 | 0 | 0 | 0 |
| 254.0 | 0 | 0 | 0 | 0 | 0 | 0 | 0 | 0 | 0 | 0 | 0 | 0 | 0 | 0 |
| 255.0 | 0 | 0 | 0 | 0 | 0 | 0 | 0 | 0 | 0 | 0 | 0 | 0 | 0 | 0 |
| 256.0 | 0 | 0 | 0 | 0 | 0 | 0 | 0 | 0 | 0 | 0 | 0 | 0 | 0 | 0 |
| 257.0 | 0 | 0 | 0 | 0 | 0 | 0 | 0 | 0 | 0 | 0 | 0 | 0 | 0 | 0 |
| 258.0 | 0 | 0 | 0 | 0 | 0 | 0 | 0 | 0 | 0 | 0 | 0 | 0 | 0 | 0 |
| 259.0 | 0 | 0 | 0 | 0 | 0 | 0 | 0 | 0 | 0 | 0 | 0 | 0 | 0 | 0 |
| 260.0 | 0 | 0 | 0 | 0 | 0 | 0 | 0 | 0 | 0 | 0 | 0 | 0 | 0 | 0 |
| 261.0 | 0 | 0 | 0 | 0 | 0 | 0 | 0 | 0 | 0 | 0 | 0 | 0 | 0 | 0 |
| 262.0 | 0 | 0 | 0 | 0 | 0 | 0 | 0 | 0 | 0 | 0 | 0 | 0 | 0 | 0 |
| 263.0 | 0 | 0 | 0 | 0 | 0 | 0 | 0 | 0 | 0 | 0 | 0 | 0 | 0 | 0 |
| 264.0 | 0 | 0 | 0 | 0 | 0 | 0 | 0 | 0 | 0 | 0 | 0 | 0 | 0 | 0 |
| 265.0 | 0 | 0 | 0 | 0 | 0 | 0 | 0 | 0 | 0 | 0 | 0 | 0 | 0 | 0 |
| 266.0 | 0 | 0 | 0 | 0 | 0 | 0 | 0 | 0 | 0 | 0 | 0 | 0 | 0 | 0 |
| 267.0 | 0 | 0 | 0 | 0 | 0 | 0 | 0 | 0 | 0 | 0 | 0 | 0 | 0 | 0 |
| 268.0 | 0 | 0 | 0 | 0 | 0 | 0 | 0 | 0 | 0 | 0 | 0 | 0 | 0 | 0 |
| 269.0 | 0 | 0 | 0 | 0 | 0 | 0 | 0 | 0 | 0 | 0 | 0 | 0 | 0 | 0 |
| 270.0 | 0 | 0 | 0 | 0 | 0 | 0 | 0 | 0 | 0 | 0 | 0 | 0 | 0 | 0 |
| 271.0 | 0 | 0 | 0 | 0 | 0 | 0 | 0 | 0 | 0 | 0 | 0 | 0 | 0 | 0 |
| 272.0 | 0 | 0 | 0 | 0 | 0 | 0 | 0 | 0 | 0 | 0 | 0 | 0 | 0 | 0 |
| 273.0 | 0 | 0 | 0 | 0 | 0 | 0 | 0 | 0 | 0 | 0 | 0 | 0 | 0 | 0 |
| 274.0 | 0 | 0 | 0 | 0 | 0 | 0 | 0 | 0 | 0 | 0 | 0 | 0 | 0 | 0 |
| 275.0 | 0 | 0 | 0 | 0 | 0 | 0 | 0 | 0 | 0 | 0 | 0 | 0 | 0 | 0 |
| 276.0 | 0 | 0 | 0 | 0 | 0 | 0 | 0 | 0 | 0 | 0 | 0 | 0 | 0 | 0 |
| 277.0 | 0 | 0 | 0 | 0 | 0 | 0 | 0 | 0 | 0 | 0 | 0 | 0 | 0 | 0 |
| 278.0 | 0 | 0 | 0 | 0 | 0 | 0 | 0 | 0 | 0 | 0 | 0 | 0 | 0 | 0 |
| 279.0 | 0 | 0 | 0 | 0 | 0 | 0 | 0 | 0 | 0 | 0 | 0 | 0 | 0 | 0 |
| 280.0 | 0 | 0 | 0 | 0 | 0 | 0 | 0 | 0 | 0 | 0 | 0 | 0 | 0 | 0 |
| 281.0 | 0 | 0 | 0 | 0 | 0 | 0 | 0 | 0 | 0 | 0 | 0 | 0 | 0 | 0 |
| 282.0 | 0 | 0 | 0 | 0 | 0 | 0 | 0 | 0 | 0 | 0 | 0 | 0 | 0 | 0 |
| 283.0 | 0 | 0 | 0 | 0 | 0 | 0 | 0 | 0 | 0 | 0 | 0 | 0 | 0 | 0 |
| 284.0 | 0 | 0 | 0 | 0 | 0 | 0 | 0 | 0 | 0 | 0 | 0 | 0 | 0 | 0 |
| 285.0 | 0 | 0 | 0 | 0 | 0 | 0 | 0 | 0 | 0 | 0 | 0 | 0 | 0 | 0 |
| 286.0 | 0 | 0 | 0 | 0 | 0 | 0 | 0 | 0 | 0 | 0 | 0 | 0 | 0 | 0 |
| 287.0 | 0 | 0 | 0 | 0 | 0 | 0 | 0 | 0 | 0 | 0 | 0 | 0 | 0 | 0 |
| 288.0 | 0 | 0 | 0 | 0 | 0 | 0 | 0 | 0 | 0 | 0 | 0 | 0 | 0 | 0 |
| 289.0 | 0 | 0 | 0 | 0 | 0 | 0 | 0 | 0 | 0 | 0 | 0 | 0 | 0 | 0 |
| 290.0 | 0 | 0 | 0 | 0 | 0 | 0 | 0 | 0 | 0 | 0 | 0 | 0 | 0 | 0 |
| 291.0 | 0 | 0 | 0 | 0 | 0 | 0 | 0 | 0 | 0 | 0 | 0 | 0 | 0 | 0 |
| 292.0 | 0 | 0 | 0 | 0 | 0 | 0 | 0 | 0 | 0 | 0 | 0 | 0 | 0 | 0 |
| 293.0 | 0 | 0 | 0 | 0 | 0 | 0 | 0 | 0 | 0 | 0 | 0 | 0 | 0 | 0 |
| 294.0 | 0 | 0 | 0 | 0 | 0 | 0 | 0 | 0 | 0 | 0 | 0 | 0 | 0 | 0 |
| 295.0 | 0 | 0 | 0 | 0 | 0 | 0 | 0 | 0 | 0 | 0 | 0 | 0 | 0 | 0 |
| 296.0 | 0 | 0 | 0 | 0 | 0 | 0 | 0 | 0 | 0 | 0 | 0 | 0 | 0 | 0 |
| 297.0 | 0 | 0 | 0 | 0 | 0 | 0 | 0 | 0 | 0 | 0 | 0 | 0 | 0 | 0 |
| 298.0 | 0 | 0 | 0 | 0 | 0 | 0 | 0 | 0 | 0 | 0 | 0 | 0 | 0 | 0 |
| 299.0 | 0 | 0 | 0 | 0 | 0 | 0 | 0 | 0 | 0 | 0 | 0 | 0 | 0 | 0 |
| 300.0 | 0 | 0 | 0 | 0 | 0 | 0 | 0 | 0 | 0 | 0 | 0 | 0 | 0 | 0 |
| 301.0 | 0 | 0 | 0 | 0 | 0 | 0 | 0 | 0 | 0 | 0 | 0 | 0 | 0 | 0 |
| 302.0 | 0 | 0 | 0 | 0 | 0 | 0 | 0 | 0 | 0 | 0 | 0 | 0 | 0 | 0 |
| 303.0 | 0 | 0 | 0 | 0 | 0 | 0 | 0 | 0 | 0 | 0 | 0 | 0 | 0 | 0 |
| 304.0 | 0 | 0 | 0 | 0 | 0 | 0 | 0 | 0 | 0 | 0 | 0 | 0 | 0 | 0 |
| 305.0 | 0 | 0 | 0 | 0 | 0 | 0 | 0 | 0 | 0 | 0 | 0 | 0 | 0 | 0 |
| 306.0 | 0 | 0 | 0 | 0 | 0 | 0 | 0 | 0 | 0 | 0 | 0 | 0 | 0 | 0 |
| 307.0 | 0 | 0 | 0 | 0 | 0 | 0 | 0 | 0 | 0 | 0 | 0 | 0 | 0 | 0 |
| 308.0 | 0 | 0 | 0 | 0 | 0 | 0 | 0 | 0 | 0 | 0 | 0 | 0 | 0 | 0 |
| 309.0 | 0 | 0 | 0 | 0 | 0 | 0 | 0 | 0 | 0 | 0 | 0 | 0 | 0 | 0 |
| 310.0 | 0 | 0 | 0 | 0 | 0 | 0 | 0 | 0 | 0 | 0 | 0 | 0 | 0 | 0 |
| 311.0 | 0 | 0 | 0 | 0 | 0 | 0 | 0 | 0 | 0 | 0 | 0 | 0 | 0 | 0 |
| 312.0 | 0 | 0 | 0 | 0 | 0 | 0 | 0 | 0 | 0 | 0 | 0 | 0 | 0 | 0 |
| 313.0 | 0 | 0 | 0 | 0 | 0 | 0 | 0 | 0 | 0 | 0 | 0 | 0 | 0 | 0 |
| 314.0 | 0 | 0 | 0 | 0 | 0 | 0 | 0 | 0 | 0 | 0 | 0 | 0 | 0 | 0 |
| 315.0 | 0 | 0 | 0 | 0 | 0 | 0 | 0 | 0 | 0 | 0 | 0 | 0 | 0 | 0 |
| 316.0 | 0 | 0 | 0 | 0 | 0 | 0 | 0 | 0 | 0 | 0 | 0 | 0 | 0 | 0 |
| 317.0 | 0 | 0 | 0 | 0 | 0 | 0 | 0 | 0 | 0 | 0 | 0 | 0 | 0 | 0 |
| 318.0 | 0 | 0 | 0 | 0 | 0 | 0 | 0 | 0 | 0 | 0 | 0 | 0 | 0 | 0 |
| 319.0 | 0 | 0 | 0 | 0 | 0 | 0 | 0 | 0 | 0 | 0 | 0 | 0 | 0 | 0 |
| 320.0 | 0 | 0 | 0 | 0 | 0 | 0 | 0 | 0 | 0 | 0 | 0 | 0 | 0 | 0 |
| 321.0 | 0 | 0 | 0 | 0 | 0 | 0 | 0 | 0 | 0 | 0 | 0 | 0 | 0 | 0 |
| 322.0 | 0 | 0 | 0 | 0 | 0 | 0 | 0 | 0 | 0 | 0 | 0 | 0 | 0 | 0 |
| 323.0 | 0 | 0 | 0 | 0 | 0 | 0 | 0 | 0 | 0 | 0 | 0 | 0 | 0 | 0 |
| 324.0 | 0 | 0 | 0 | 0 | 0 | 0 | 0 | 0 | 0 | 0 | 0 | 0 | 0 | 0 |
| 325.0 | 0 | 0 | 0 | 0 | 0 | 0 | 0 | 0 | 0 | 0 | 0 | 0 | 0 | 0 |
| 326.0 | 0 | 0 | 0 | 0 | 0 | 0 | 0 | 0 | 0 | 0 | 0 | 0 | 0 | 0 |
| 327.0 | 0 | 0 | 0 | 0 | 0 | 0 | 0 | 0 | 0 | 0 | 0 | 0 | 0 | 0 |
| 328.0 | 0 | 0 | 0 | 0 | 0 | 0 | 0 | 0 | 0 | 0 | 0 | 0 | 0 | 0 |
| 329.0 | 0 | 0 | 0 | 0 | 0 | 0 | 0 | 0 | 0 | 0 | 0 | 0 | 0 | 0 |
| 330.0 | 0 | 0 | 0 | 0 | 0 | 0 | 0 | 0 | 0 | 0 | 0 | 0 | 0 | 0 |
| 331.0 | 0 | 0 | 0 | 0 | 0 | 0 | 0 | 0 | 0 | 0 | 0 | 0 | 0 | 0 |
| 332.0 | 0 | 0 | 0 | 0 | 0 | 0 | 0 | 0 | 0 | 0 | 0 | 0 | 0 | 0 |
| 333.0 | 0 | 0 | 0 | 0 | 0 | 0 | 0 | 0 | 0 | 0 | 0 | 0 | 0 | 0 |
| 334.0 | 0 | 0 | 0 | 0 | 0 | 0 | 0 | 0 | 0 | 0 | 0 | 0 | 0 | 0 |
| 335.0 | 0 | 0 | 0 | 0 | 0 | 0 | 0 | 0 | 0 | 0 | 0 | 0 | 0 | 0 |
| 336.0 | 0 | 0 | 0 | 0 | 0 | 0 | 0 | 0 | 0 | 0 | 0 | 0 | 0 | 0 |
| 337.0 | 0 | 0 | 0 | 0 | 0 | 0 | 0 | 0 | 0 | 0 | 0 | 0 | 0 | 0 |
| 338.0 | 0 | 0 | 0 | 0 | 0 | 0 | 0 | 0 | 0 | 0 | 0 | 0 | 0 | 0 |
| 339.0 | 0 | 0 | 0 | 0 | 0 | 0 | 0 | 0 | 0 | 0 | 0 | 0 | 0 | 0 |
| 340.0 | 0 | 0 | 0 | 0 | 0 | 0 | 0 | 0 | 0 | 0 | 0 | 0 | 0 | 0 |
| 341.0 | 0 | 0 | 0 | 0 | 0 | 0 | 0 | 0 | 0 | 0 | 0 | 0 | 0 | 0 |
| 342.0 | 0 | 0 | 0 | 0 | 0 | 0 | 0 | 0 | 0 | 0 | 0 | 0 | 0 | 0 |
| 343.0 | 0 | 0 | 0 | 0 | 0 | 0 | 0 | 0 | 0 | 0 | 0 | 0 | 0 | 0 |
| 344.0 | 0 | 0 | 0 | 0 | 0 | 0 | 0 | 0 | 0 | 0 | 0 | 0 | 0 | 0 |
| 345.0 | 0 | 0 | 0 | 0 | 0 | 0 | 0 | 0 | 0 | 0 | 0 | 0 | 0 | 0 |
| 346.0 | 0 | 0 | 0 | 0 | 0 | 0 | 0 | 0 | 0 | 0 | 0 | 0 | 0 | 0 |
| 347.0 | 0 | 0 | 0 | 0 | 0 | 0 | 0 | 0 | 0 | 0 | 0 | 0 | 0 | 0 |
| 348.0 | 0 | 0 | 0 | 0 | 0 | 0 | 0 | 0 | 0 | 0 | 0 | 0 | 0 | 0 |
| 349.0 | 0 | 0 | 0 | 0 | 0 | 0 | 0 | 0 | 0 | 0 | 0 | 0 | 0 | 0 |
| 350.0 | 0 | 0 | 0 | 0 | 0 | 0 | 0 | 0 | 0 | 0 | 0 | 0 | 0 | 0 |
| 351.0 | 0 | 0 | 0 | 0 | 0 | 0 | 0 | 0 | 0 | 0 | 0 | 0 | 0 | 0 |
| 352.0 | 0 | 0 | 0 | 0 | 0 | 0 | 0 | 0 | 0 | 0 | 0 | 0 | 0 | 0 |
| 353.0 | 0 | 0 | 0 | 0 | 0 | 0 | 0 | 0 | 0 | 0 | 0 | 0 | 0 | 0 |
| 354.0 | 0 | 0 | 0 | 0 | 0 | 0 | 0 | 0 | 0 | 0 | 0 | 0 | 0 | 0 |
| 355.0 | 0 | 0 | 0 | 0 | 0 | 0 | 0 | 0 | 0 | 0 | 0 | 0 | 0 | 0 |
| 356.0 | 0 | 0 | 0 | 0 | 0 | 0 | 0 | 0 | 0 | 0 | 0 | 0 | 0 | 0 |
| 357.0 | 0 | 0 | 0 | 0 | 0 | 0 | 0 | 0 | 0 | 0 | 0 | 0 | 0 | 0 |
| 358.0 | 0 | 0 | 0 | 0 | 0 | 0 | 0 | 0 | 0 | 0 | 0 | 0 | 0 | 0 |
| 359.0 | 0 | 0 | 0 | 0 | 0 | 0 | 0 | 0 | 0 | 0 | 0 | 0 | 0 | 0 |
| 360.0 | 0 | 0 | 0 | 0 | 0 | 0 | 0 | 0 | 0 | 0 | 0 | 0 | 0 | 0 |